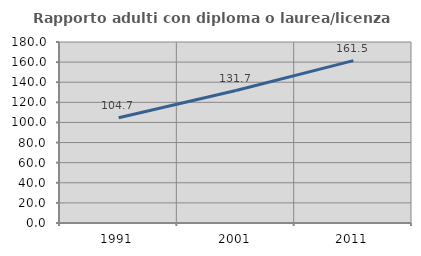
| Category | Rapporto adulti con diploma o laurea/licenza media  |
|---|---|
| 1991.0 | 104.677 |
| 2001.0 | 131.742 |
| 2011.0 | 161.474 |